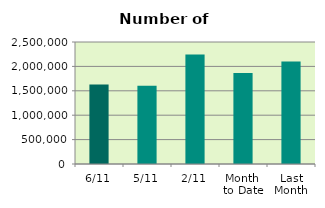
| Category | Series 0 |
|---|---|
| 6/11 | 1629416 |
| 5/11 | 1601778 |
| 2/11 | 2242140 |
| Month 
to Date | 1865743.5 |
| Last
Month | 2101052.87 |